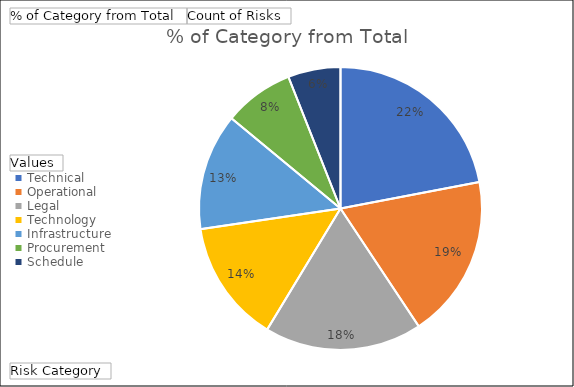
| Category | % of Category from Total | Count of Risks |
|---|---|---|
| Technical | 0.22 | 2 |
| Operational | 0.187 | 2 |
| Legal | 0.18 | 2 |
| Technology | 0.14 | 2 |
| Infrastructure | 0.133 | 1 |
| Procurement | 0.08 | 1 |
| Schedule | 0.06 | 1 |